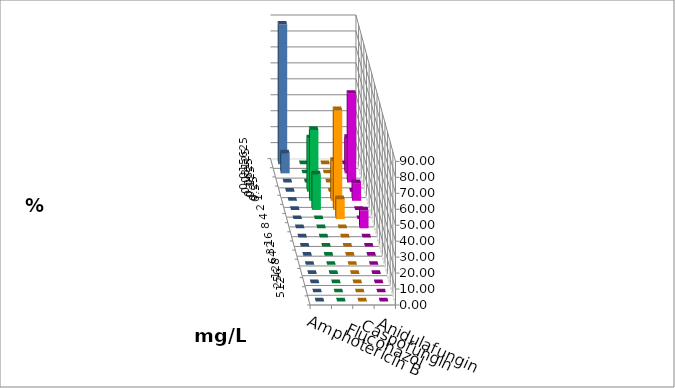
| Category | Amphotericin B | Fluconazol | Caspofungin | Anidulafungin |
|---|---|---|---|---|
| 0.015625 | 0 | 0 | 0 | 87.5 |
| 0.03125 | 0 | 0 | 22.222 | 12.5 |
| 0.0625 | 0 | 0 | 55.556 | 0 |
| 0.125 | 33.333 | 0 | 0 | 0 |
| 0.25 | 44.444 | 25 | 11.111 | 0 |
| 0.5 | 22.222 | 62.5 | 0 | 0 |
| 1.0 | 0 | 12.5 | 0 | 0 |
| 2.0 | 0 | 0 | 11.111 | 0 |
| 4.0 | 0 | 0 | 0 | 0 |
| 8.0 | 0 | 0 | 0 | 0 |
| 16.0 | 0 | 0 | 0 | 0 |
| 32.0 | 0 | 0 | 0 | 0 |
| 64.0 | 0 | 0 | 0 | 0 |
| 128.0 | 0 | 0 | 0 | 0 |
| 256.0 | 0 | 0 | 0 | 0 |
| 512.0 | 0 | 0 | 0 | 0 |